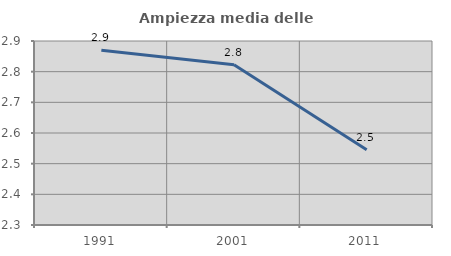
| Category | Ampiezza media delle famiglie |
|---|---|
| 1991.0 | 2.87 |
| 2001.0 | 2.822 |
| 2011.0 | 2.545 |